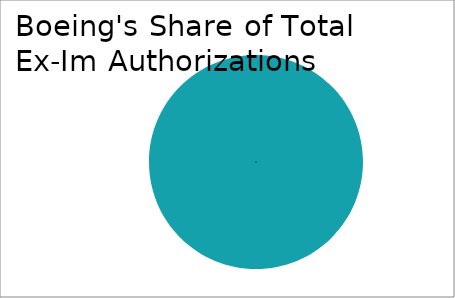
| Category | Series 0 |
|---|---|
| 0 | 8075670753 |
| 1 | 0 |